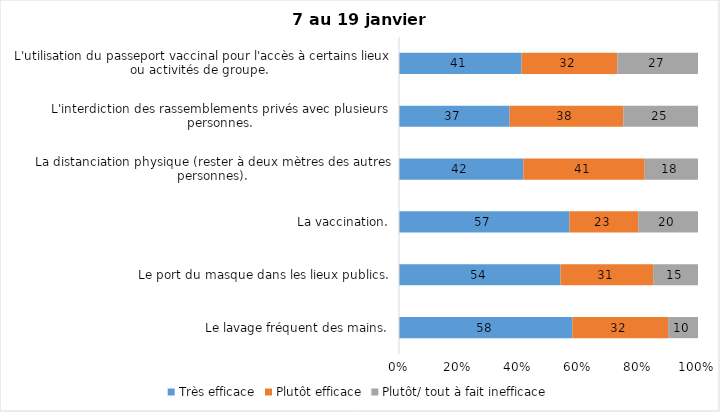
| Category | Très efficace | Plutôt efficace | Plutôt/ tout à fait inefficace |
|---|---|---|---|
| Le lavage fréquent des mains. | 58 | 32 | 10 |
| Le port du masque dans les lieux publics. | 54 | 31 | 15 |
| La vaccination. | 57 | 23 | 20 |
| La distanciation physique (rester à deux mètres des autres personnes). | 42 | 41 | 18 |
| L'interdiction des rassemblements privés avec plusieurs personnes. | 37 | 38 | 25 |
| L'utilisation du passeport vaccinal pour l'accès à certains lieux ou activités de groupe.  | 41 | 32 | 27 |